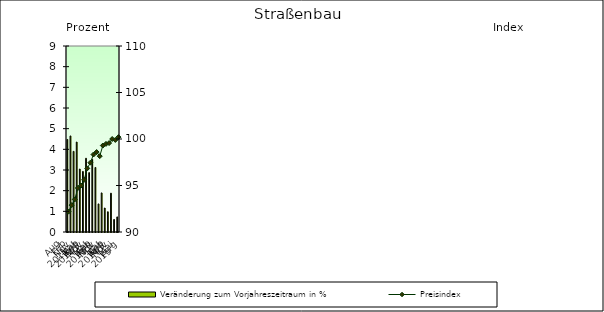
| Category | Veränderung zum Vorjahreszeitraum in % |
|---|---|
| 0 | 4.478 |
| 1 | 4.649 |
| 2 | 3.902 |
| 3 | 4.352 |
| 4 | 3.048 |
| 5 | 2.93 |
| 6 | 3.568 |
| 7 | 2.873 |
| 8 | 3.512 |
| 9 | 3.122 |
| 10 | 1.36 |
| 11 | 1.892 |
| 12 | 1.161 |
| 13 | 0.98 |
| 14 | 1.878 |
| 15 | 0.607 |
| 16 | 0.731 |